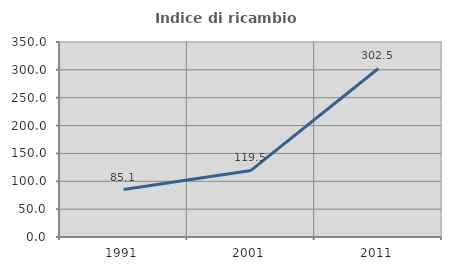
| Category | Indice di ricambio occupazionale  |
|---|---|
| 1991.0 | 85.145 |
| 2001.0 | 119.527 |
| 2011.0 | 302.459 |